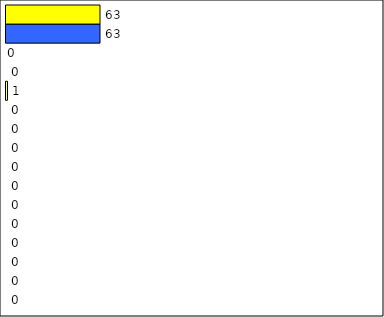
| Category | -2 | -1 | 0 | 1 | 2 | 3 | 4 | 5 | 6 | 7 | 8 | 9 | 10 | 11 | 12 | Perfect Round |
|---|---|---|---|---|---|---|---|---|---|---|---|---|---|---|---|---|
| 0 | 0 | 0 | 0 | 0 | 0 | 0 | 0 | 0 | 0 | 0 | 0 | 1 | 0 | 0 | 63 | 63 |